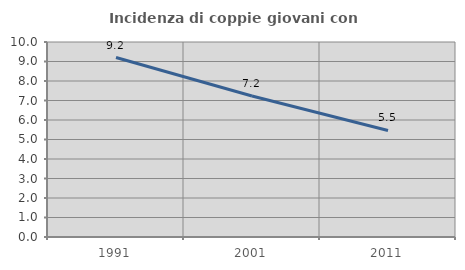
| Category | Incidenza di coppie giovani con figli |
|---|---|
| 1991.0 | 9.204 |
| 2001.0 | 7.233 |
| 2011.0 | 5.463 |